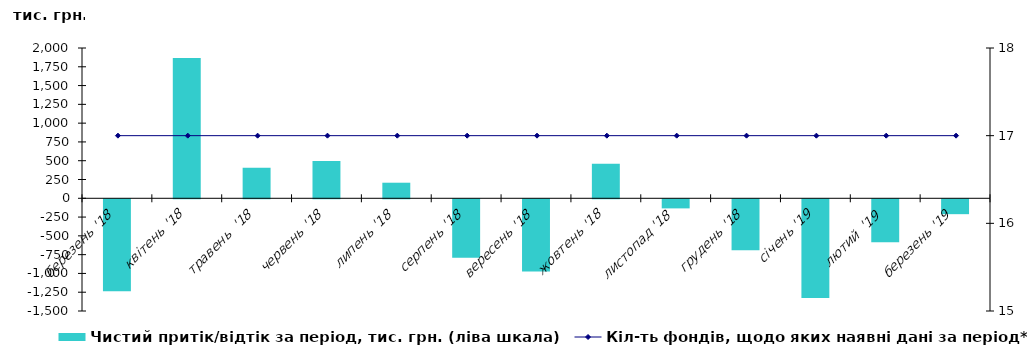
| Category | Чистий притік/відтік за період, тис. грн. (ліва шкала) |
|---|---|
| березень '18 | -1224.388 |
| квітень '18 | 1868.195 |
| травень  '18 | 407.295 |
| червень '18 | 494.616 |
| липень '18 | 207.262 |
| серпень '18 | -776.577 |
| вересень '18 | -962.329 |
| жовтень '18 | 459.554 |
| листопад '18 | -121.1 |
| грудень '18 | -679.66 |
| січень '19 | -1313.63 |
| лютий  '19 | -571.917 |
| березень '19 | -198.106 |